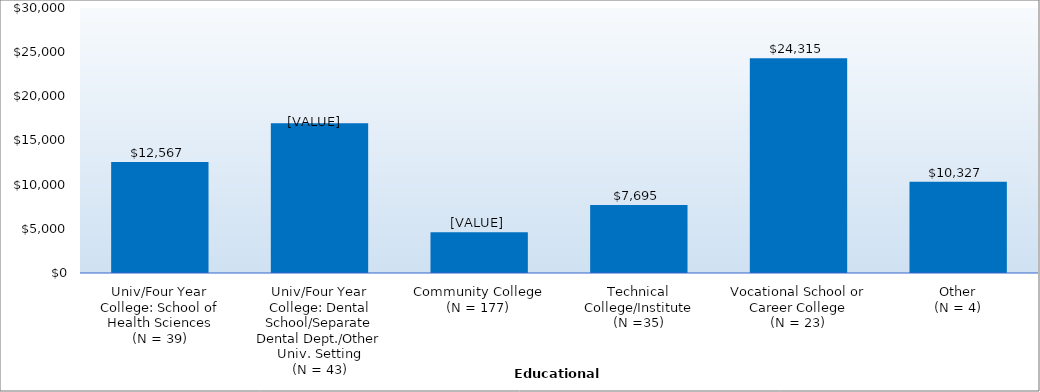
| Category | Series 0 |
|---|---|
| Univ/Four Year College: School of Health Sciences
(N = 39) | 12567 |
| Univ/Four Year College: Dental School/Separate Dental Dept./Other Univ. Setting
(N = 43) | 16956.05 |
| Community College
(N = 177) | 4613 |
| Technical College/Institute
(N =35) | 7695 |
| Vocational School or Career College
(N = 23) | 24315 |
| Other
(N = 4) | 10327 |